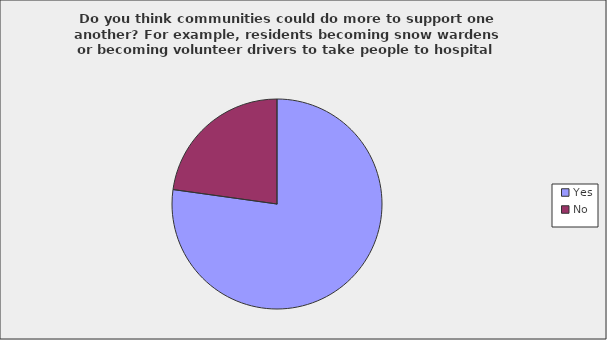
| Category | Series 0 |
|---|---|
| Yes | 0.772 |
| No | 0.228 |